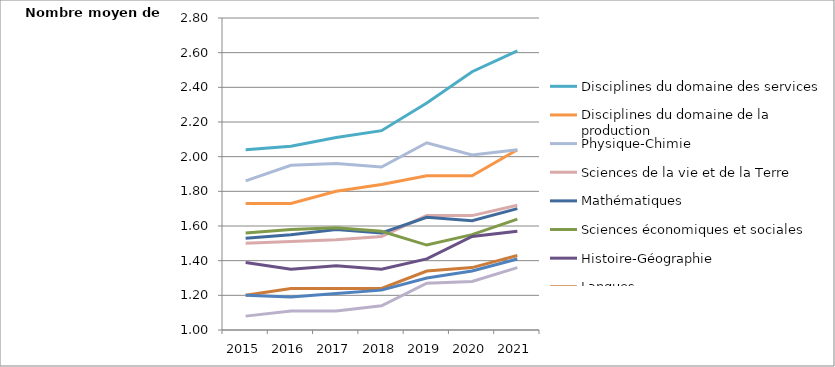
| Category | Disciplines du domaine des services | Disciplines du domaine de la production | Physique-Chimie | Sciences de la vie et de la Terre | Mathématiques | Sciences économiques et sociales | Histoire-Géographie | Langues | Lettres | Education physique et sportive |
|---|---|---|---|---|---|---|---|---|---|---|
| 2015 | 2.04 | 1.73 | 1.86 | 1.5 | 1.53 | 1.56 | 1.39 | 1.2 | 1.2 | 1.08 |
| 2016 | 2.06 | 1.73 | 1.95 | 1.51 | 1.55 | 1.58 | 1.35 | 1.24 | 1.19 | 1.11 |
| 2017 | 2.11 | 1.8 | 1.96 | 1.52 | 1.58 | 1.59 | 1.37 | 1.24 | 1.21 | 1.11 |
| 2018 | 2.15 | 1.84 | 1.94 | 1.54 | 1.56 | 1.57 | 1.35 | 1.24 | 1.23 | 1.14 |
| 2019 | 2.31 | 1.89 | 2.08 | 1.66 | 1.65 | 1.49 | 1.41 | 1.34 | 1.3 | 1.27 |
| 2020 | 2.49 | 1.89 | 2.01 | 1.66 | 1.63 | 1.55 | 1.54 | 1.36 | 1.34 | 1.28 |
| 2021 | 2.61 | 2.04 | 2.04 | 1.72 | 1.7 | 1.64 | 1.57 | 1.43 | 1.41 | 1.36 |